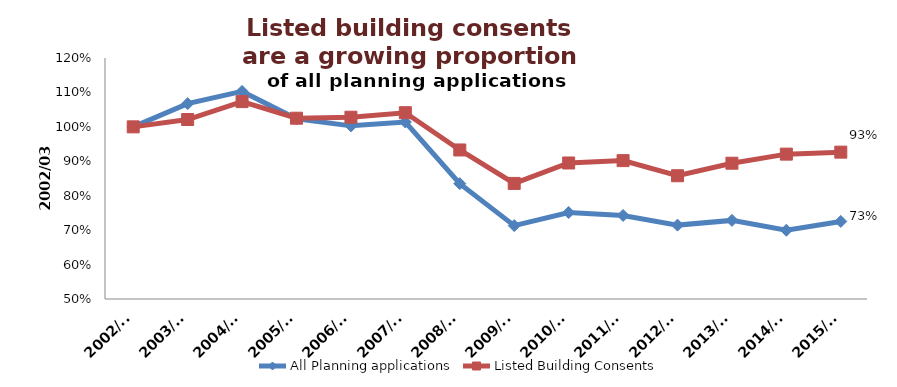
| Category | All Planning applications | Listed Building Consents |
|---|---|---|
| 2002/03 | 1 | 1 |
| 2003/04 | 1.067 | 1.021 |
| 2004/05 | 1.103 | 1.073 |
| 2005/06 | 1.024 | 1.025 |
| 2006/07 | 1.003 | 1.028 |
| 2007/08 | 1.014 | 1.041 |
| 2008/09 | 0.835 | 0.933 |
| 2009/10 | 0.713 | 0.836 |
| 2010/11 | 0.751 | 0.895 |
| 2011/12 | 0.743 | 0.902 |
| 2012/13 | 0.715 | 0.858 |
| 2013/14 | 0.728 | 0.894 |
| 2014/15 | 0.7 | 0.921 |
| 2015/16 | 0.725 | 0.927 |